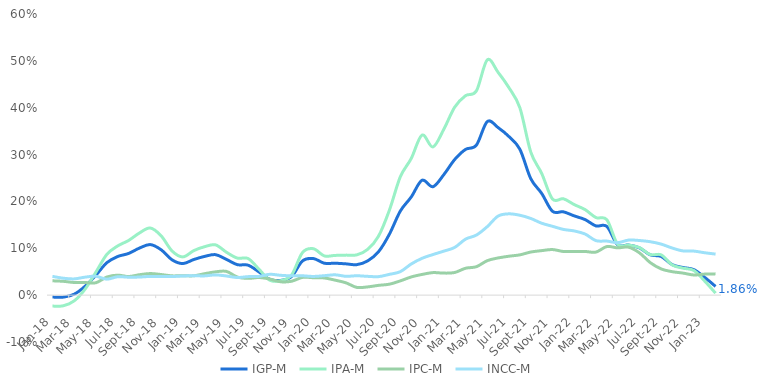
| Category | IGP-M | IPA-M | IPC-M | INCC-M |
|---|---|---|---|---|
| 2018-01-01 | -0.004 | -0.023 | 0.031 | 0.04 |
| 2018-02-01 | -0.004 | -0.023 | 0.03 | 0.036 |
| 2018-03-01 | 0.002 | -0.012 | 0.027 | 0.035 |
| 2018-04-01 | 0.019 | 0.013 | 0.027 | 0.038 |
| 2018-05-01 | 0.043 | 0.049 | 0.026 | 0.04 |
| 2018-06-01 | 0.069 | 0.087 | 0.039 | 0.034 |
| 2018-07-01 | 0.082 | 0.105 | 0.043 | 0.039 |
| 2018-08-01 | 0.089 | 0.117 | 0.04 | 0.038 |
| 2018-09-01 | 0.1 | 0.133 | 0.044 | 0.039 |
| 2018-10-01 | 0.108 | 0.143 | 0.046 | 0.04 |
| 2018-11-01 | 0.097 | 0.127 | 0.044 | 0.04 |
| 2018-12-01 | 0.075 | 0.094 | 0.041 | 0.04 |
| 2019-01-01 | 0.067 | 0.082 | 0.042 | 0.041 |
| 2019-02-01 | 0.076 | 0.095 | 0.041 | 0.041 |
| 2019-03-01 | 0.083 | 0.103 | 0.046 | 0.041 |
| 2019-04-01 | 0.086 | 0.107 | 0.05 | 0.043 |
| 2019-05-01 | 0.076 | 0.092 | 0.051 | 0.041 |
| 2019-06-01 | 0.065 | 0.079 | 0.039 | 0.038 |
| 2019-07-01 | 0.064 | 0.078 | 0.036 | 0.04 |
| 2019-08-01 | 0.05 | 0.055 | 0.038 | 0.04 |
| 2019-09-01 | 0.034 | 0.032 | 0.034 | 0.044 |
| 2019-10-01 | 0.032 | 0.031 | 0.028 | 0.042 |
| 2019-11-01 | 0.04 | 0.043 | 0.03 | 0.041 |
| 2019-12-01 | 0.073 | 0.091 | 0.038 | 0.041 |
| 2020-01-01 | 0.078 | 0.099 | 0.037 | 0.04 |
| 2020-02-01 | 0.068 | 0.084 | 0.037 | 0.042 |
| 2020-03-01 | 0.068 | 0.085 | 0.032 | 0.043 |
| 2020-04-01 | 0.067 | 0.085 | 0.026 | 0.04 |
| 2020-05-01 | 0.065 | 0.086 | 0.016 | 0.041 |
| 2020-06-01 | 0.073 | 0.098 | 0.018 | 0.04 |
| 2020-07-01 | 0.093 | 0.126 | 0.021 | 0.04 |
| 2020-08-01 | 0.13 | 0.182 | 0.023 | 0.044 |
| 2020-09-01 | 0.179 | 0.253 | 0.03 | 0.05 |
| 2020-10-01 | 0.209 | 0.291 | 0.039 | 0.066 |
| 2020-11-01 | 0.245 | 0.342 | 0.044 | 0.079 |
| 2020-12-01 | 0.231 | 0.316 | 0.048 | 0.087 |
| 2021-01-01 | 0.257 | 0.354 | 0.047 | 0.094 |
| 2021-02-01 | 0.289 | 0.401 | 0.048 | 0.102 |
| 2021-03-01 | 0.311 | 0.426 | 0.057 | 0.12 |
| 2021-04-01 | 0.32 | 0.436 | 0.061 | 0.128 |
| 2021-05-01 | 0.37 | 0.502 | 0.074 | 0.146 |
| 2021-06-01 | 0.358 | 0.475 | 0.079 | 0.169 |
| 2021-07-01 | 0.338 | 0.442 | 0.083 | 0.174 |
| 2021-08-01 | 0.311 | 0.4 | 0.086 | 0.17 |
| 2021-09-01 | 0.249 | 0.305 | 0.092 | 0.164 |
| 2021-10-01 | 0.217 | 0.26 | 0.095 | 0.154 |
| 2021-11-01 | 0.179 | 0.205 | 0.097 | 0.147 |
| 2021-12-01 | 0.178 | 0.206 | 0.093 | 0.14 |
| 2022-01-01 | 0.169 | 0.193 | 0.093 | 0.137 |
| 2022-02-01 | 0.161 | 0.182 | 0.093 | 0.13 |
| 2022-03-01 | 0.148 | 0.166 | 0.092 | 0.116 |
| 2022-04-01 | 0.147 | 0.161 | 0.104 | 0.115 |
| 2022-05-01 | 0.107 | 0.108 | 0.101 | 0.112 |
| 2022-06-01 | 0.107 | 0.107 | 0.102 | 0.118 |
| 2022-07-01 | 0.101 | 0.101 | 0.09 | 0.117 |
| 2022-08-01 | 0.086 | 0.086 | 0.069 | 0.114 |
| 2022-09-01 | 0.082 | 0.086 | 0.056 | 0.109 |
| 2022-10-01 | 0.065 | 0.065 | 0.05 | 0.101 |
| 2022-11-01 | 0.059 | 0.058 | 0.047 | 0.094 |
| 2022-12-01 | 0.054 | 0.053 | 0.043 | 0.094 |
| 2023-01-01 | 0.038 | 0.03 | 0.045 | 0.09 |
| 2023-02-01 | 0.019 | 0.004 | 0.045 | 0.088 |